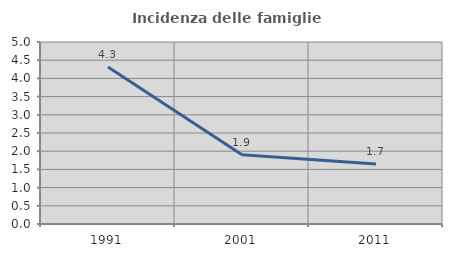
| Category | Incidenza delle famiglie numerose |
|---|---|
| 1991.0 | 4.311 |
| 2001.0 | 1.904 |
| 2011.0 | 1.651 |